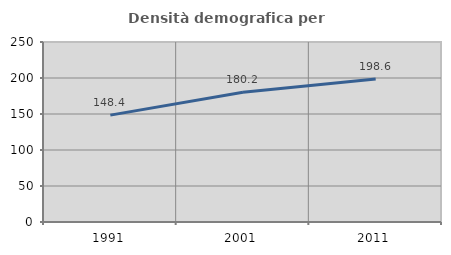
| Category | Densità demografica |
|---|---|
| 1991.0 | 148.418 |
| 2001.0 | 180.184 |
| 2011.0 | 198.603 |